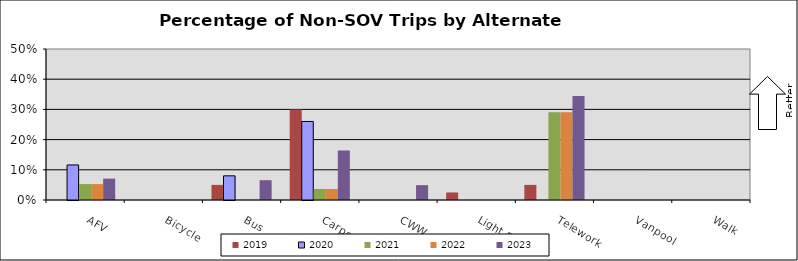
| Category | 2019 | 2020 | 2021 | 2022 | 2023 |
|---|---|---|---|---|---|
| AFV | 0 | 0.116 | 0.053 | 0.053 | 0.071 |
| Bicycle | 0 | 0 | 0 | 0 | 0 |
| Bus | 0.05 | 0.08 | 0 | 0 | 0.066 |
| Carpool | 0.3 | 0.26 | 0.036 | 0.036 | 0.164 |
| CWW | 0 | 0 | 0 | 0 | 0.049 |
| Light Rail | 0.025 | 0 | 0 | 0 | 0 |
| Telework | 0.05 | 0 | 0.291 | 0.291 | 0.344 |
| Vanpool | 0 | 0 | 0 | 0 | 0 |
| Walk | 0 | 0 | 0 | 0 | 0 |